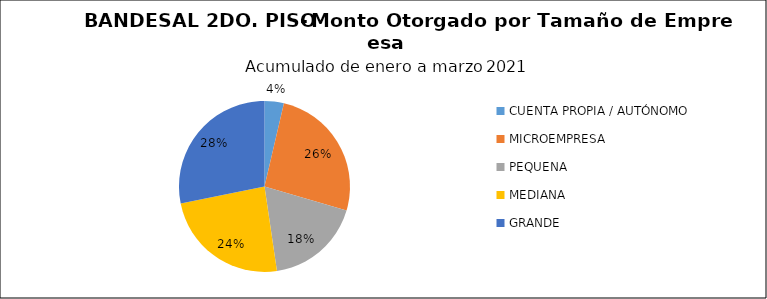
| Category | Monto | Créditos |
|---|---|---|
| CUENTA PROPIA / AUTÓNOMO | 0.968 | 28 |
| MICROEMPRESA | 6.862 | 454 |
| PEQUENA | 4.805 | 163 |
| MEDIANA | 6.402 | 57 |
| GRANDE | 7.466 | 9 |